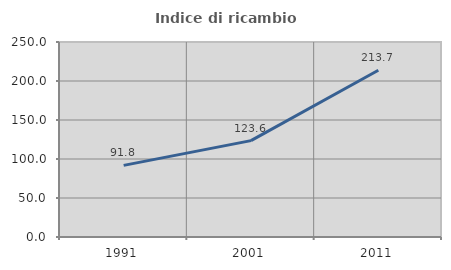
| Category | Indice di ricambio occupazionale  |
|---|---|
| 1991.0 | 91.822 |
| 2001.0 | 123.585 |
| 2011.0 | 213.714 |